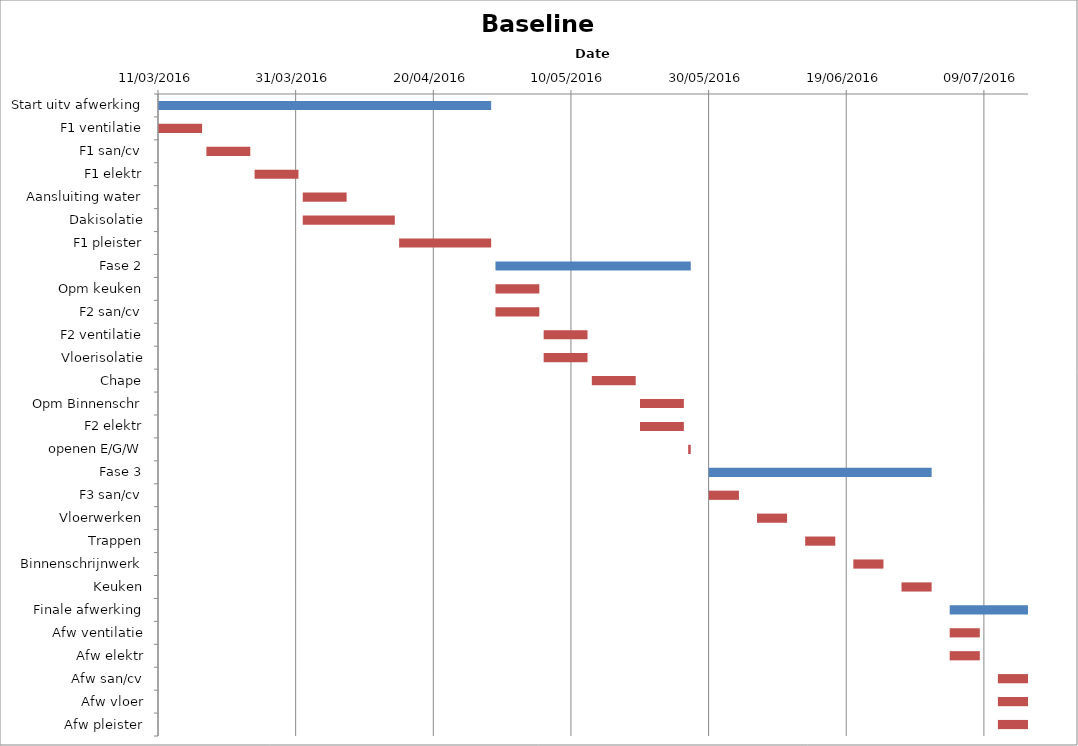
| Category | Baseline start | Actual duration |
|---|---|---|
| Start uitv afwerking | 42440.333 | 48.375 |
| F1 ventilatie | 42440.333 | 6.375 |
| F1 san/cv | 42447.333 | 6.375 |
| F1 elektr | 42454.333 | 6.375 |
| Aansluiting water | 42461.333 | 6.375 |
| Dakisolatie | 42461.333 | 13.375 |
| F1 pleister | 42475.333 | 13.375 |
| Fase 2 | 42489.333 | 28.375 |
| Opm keuken | 42489.333 | 6.375 |
| F2 san/cv | 42489.333 | 6.375 |
| F2 ventilatie | 42496.333 | 6.375 |
| Vloerisolatie | 42496.333 | 6.375 |
| Chape | 42503.333 | 6.375 |
| Opm Binnenschr | 42510.333 | 6.375 |
| F2 elektr | 42510.333 | 6.375 |
| openen E/G/W | 42517.333 | 0.375 |
| Fase 3 | 42520.333 | 32.375 |
| F3 san/cv | 42520.333 | 4.375 |
| Vloerwerken | 42527.333 | 4.375 |
| Trappen | 42534.333 | 4.375 |
| Binnenschrijnwerk | 42541.333 | 4.375 |
| Keuken | 42548.333 | 4.375 |
| Finale afwerking | 42555.333 | 11.375 |
| Afw ventilatie | 42555.333 | 4.375 |
| Afw elektr | 42555.333 | 4.375 |
| Afw san/cv | 42562.333 | 4.375 |
| Afw vloer | 42562.333 | 4.375 |
| Afw pleister | 42562.333 | 4.375 |